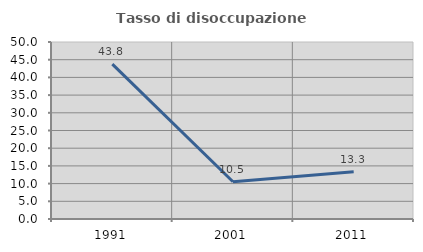
| Category | Tasso di disoccupazione giovanile  |
|---|---|
| 1991.0 | 43.75 |
| 2001.0 | 10.526 |
| 2011.0 | 13.333 |